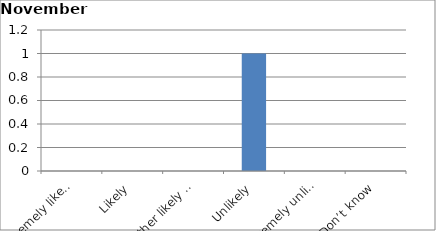
| Category | Series 0 |
|---|---|
| Extremely likely | 0 |
| Likely | 0 |
| Neither likely nor unlikely | 0 |
| Unlikely | 1 |
| Extremely unlikely | 0 |
| Don’t know | 0 |